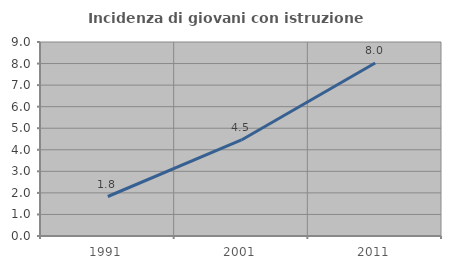
| Category | Incidenza di giovani con istruzione universitaria |
|---|---|
| 1991.0 | 1.832 |
| 2001.0 | 4.457 |
| 2011.0 | 8.029 |